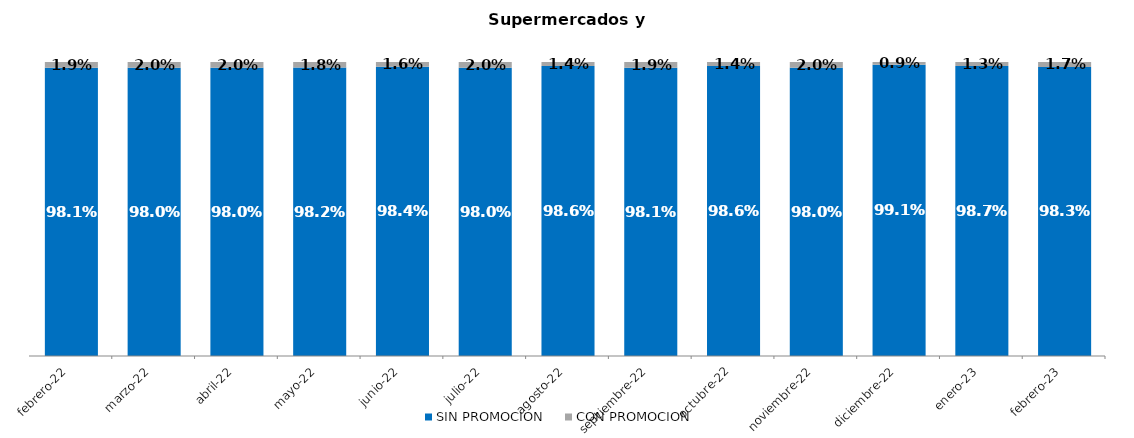
| Category | SIN PROMOCION   | CON PROMOCION   |
|---|---|---|
| 2022-02-01 | 0.981 | 0.019 |
| 2022-03-01 | 0.98 | 0.02 |
| 2022-04-01 | 0.98 | 0.02 |
| 2022-05-01 | 0.982 | 0.018 |
| 2022-06-01 | 0.984 | 0.016 |
| 2022-07-01 | 0.98 | 0.02 |
| 2022-08-01 | 0.986 | 0.014 |
| 2022-09-01 | 0.981 | 0.019 |
| 2022-10-01 | 0.986 | 0.014 |
| 2022-11-01 | 0.98 | 0.02 |
| 2022-12-01 | 0.991 | 0.009 |
| 2023-01-01 | 0.987 | 0.013 |
| 2023-02-01 | 0.983 | 0.017 |